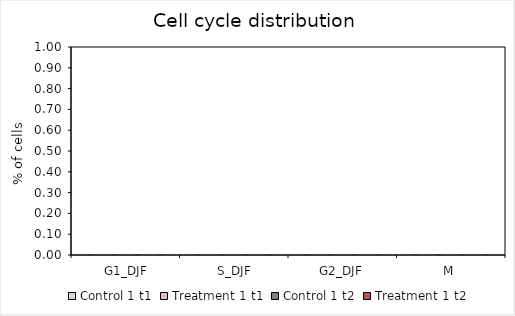
| Category | Control 1 | Treatment 1 |
|---|---|---|
|  G1_DJF | 0 | 0 |
|  S_DJF | 0 | 0 |
| G2_DJF | 0 | 0 |
| M | 0 | 0 |